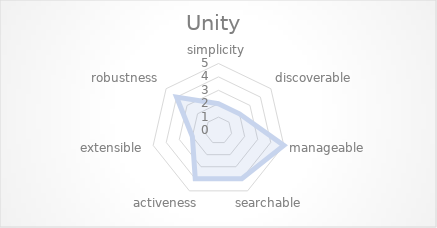
| Category | Unity |
|---|---|
| simplicity | 2 |
| discoverable | 2 |
| manageable | 5 |
| searchable | 4 |
| activeness | 4 |
| extensible | 2 |
| robustness | 4 |